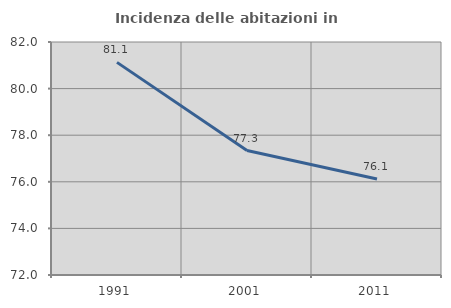
| Category | Incidenza delle abitazioni in proprietà  |
|---|---|
| 1991.0 | 81.125 |
| 2001.0 | 77.342 |
| 2011.0 | 76.119 |